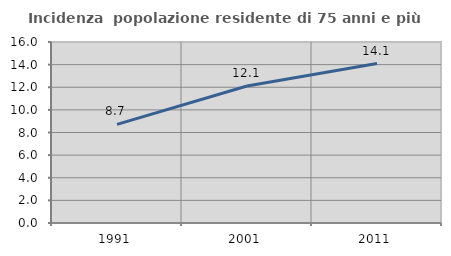
| Category | Incidenza  popolazione residente di 75 anni e più |
|---|---|
| 1991.0 | 8.719 |
| 2001.0 | 12.112 |
| 2011.0 | 14.094 |